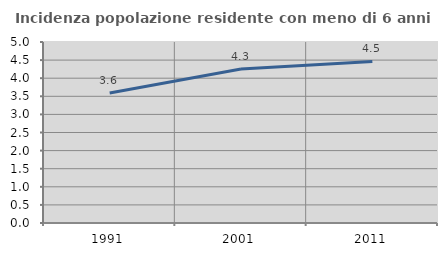
| Category | Incidenza popolazione residente con meno di 6 anni |
|---|---|
| 1991.0 | 3.59 |
| 2001.0 | 4.255 |
| 2011.0 | 4.464 |